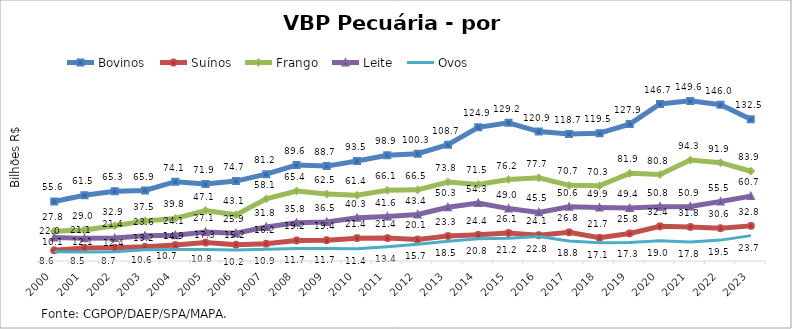
| Category | Bovinos | Suínos | Frango | Leite | Ovos |
|---|---|---|---|---|---|
| 2000 | 55.633 | 10.073 | 27.789 | 21.975 | 8.592 |
| 2001 | 61.498 | 12.085 | 29.001 | 21.146 | 8.467 |
| 2002 | 65.261 | 12.386 | 32.933 | 21.412 | 8.723 |
| 2003 | 65.865 | 13.238 | 37.492 | 23.579 | 10.552 |
| 2004 | 74.106 | 14.883 | 39.836 | 24.099 | 10.694 |
| 2005 | 71.946 | 17.256 | 47.149 | 27.104 | 10.767 |
| 2006 | 74.698 | 15.179 | 43.135 | 25.889 | 10.227 |
| 2007 | 81.179 | 16.231 | 58.075 | 31.827 | 10.87 |
| 2008 | 89.631 | 19.219 | 65.433 | 35.804 | 11.739 |
| 2009 | 88.697 | 19.428 | 62.547 | 36.502 | 11.705 |
| 2010 | 93.513 | 21.372 | 61.423 | 40.312 | 11.384 |
| 2011 | 98.858 | 21.406 | 66.068 | 41.557 | 13.414 |
| 2012 | 100.331 | 20.099 | 66.534 | 43.425 | 15.725 |
| 2013 | 108.723 | 23.272 | 73.814 | 50.251 | 18.494 |
| 2014 | 124.903 | 24.443 | 71.548 | 54.265 | 20.779 |
| 2015 | 129.202 | 26.122 | 76.16 | 48.983 | 21.157 |
| 2016 | 120.939 | 24.107 | 77.73 | 45.451 | 22.809 |
| 2017 | 118.681 | 26.761 | 70.7 | 50.641 | 18.801 |
| 2018 | 119.476 | 21.672 | 70.288 | 49.889 | 17.096 |
| 2019 | 127.933 | 25.76 | 81.911 | 49.426 | 17.314 |
| 2020 | 146.747 | 32.38 | 80.793 | 50.817 | 19.014 |
| 2021 | 149.643 | 31.804 | 94.293 | 50.873 | 17.818 |
| 2022 | 146.02 | 30.623 | 91.904 | 55.543 | 19.519 |
| 2023 | 132.467 | 32.823 | 83.897 | 60.657 | 23.717 |